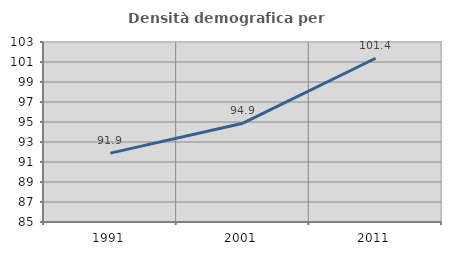
| Category | Densità demografica |
|---|---|
| 1991.0 | 91.886 |
| 2001.0 | 94.882 |
| 2011.0 | 101.374 |